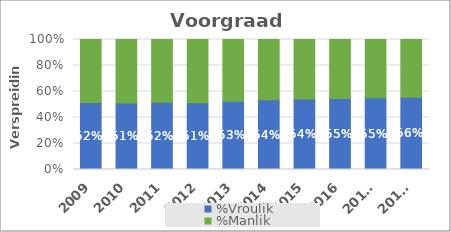
| Category | %Vroulik | %Manlik |
|---|---|---|
| 2009 | 0.516 | 0.484 |
| 2010 | 0.512 | 0.488 |
| 2011 | 0.517 | 0.483 |
| 2012 | 0.514 | 0.486 |
| 2013 | 0.526 | 0.474 |
| 2014 | 0.536 | 0.464 |
| 2015 | 0.542 | 0.458 |
| 2016 | 0.546 | 0.454 |
| 2017* | 0.553 | 0.447 |
| 2018* | 0.556 | 0.444 |